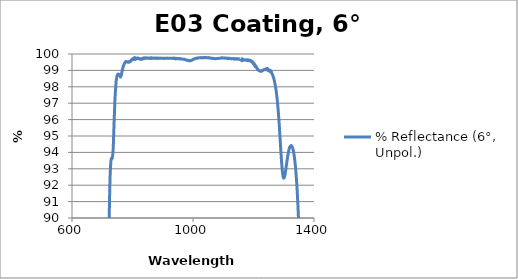
| Category | % Reflectance (6°, Unpol.) |
|---|---|
| 2500.0 | 4.981 |
| 2499.0 | 4.959 |
| 2498.0 | 4.927 |
| 2497.0 | 4.93 |
| 2496.0 | 4.921 |
| 2495.0 | 4.915 |
| 2494.0 | 4.916 |
| 2493.0 | 4.923 |
| 2492.0 | 4.924 |
| 2491.0 | 4.958 |
| 2490.0 | 4.956 |
| 2489.0 | 4.981 |
| 2488.0 | 4.993 |
| 2487.0 | 5.026 |
| 2486.0 | 5.058 |
| 2485.0 | 5.099 |
| 2484.0 | 5.131 |
| 2483.0 | 5.174 |
| 2482.0 | 5.209 |
| 2481.0 | 5.26 |
| 2480.0 | 5.331 |
| 2479.0 | 5.384 |
| 2478.0 | 5.448 |
| 2477.0 | 5.503 |
| 2476.0 | 5.581 |
| 2475.0 | 5.654 |
| 2474.0 | 5.726 |
| 2473.0 | 5.809 |
| 2472.0 | 5.899 |
| 2471.0 | 5.988 |
| 2470.0 | 6.072 |
| 2469.0 | 6.156 |
| 2468.0 | 6.258 |
| 2467.0 | 6.359 |
| 2466.0 | 6.477 |
| 2465.0 | 6.57 |
| 2464.0 | 6.68 |
| 2463.0 | 6.813 |
| 2462.0 | 6.91 |
| 2461.0 | 7.033 |
| 2460.0 | 7.154 |
| 2459.0 | 7.27 |
| 2458.0 | 7.398 |
| 2457.0 | 7.538 |
| 2456.0 | 7.675 |
| 2455.0 | 7.787 |
| 2454.0 | 7.933 |
| 2453.0 | 8.07 |
| 2452.0 | 8.208 |
| 2451.0 | 8.361 |
| 2450.0 | 8.51 |
| 2449.0 | 8.646 |
| 2448.0 | 8.807 |
| 2447.0 | 8.952 |
| 2446.0 | 9.11 |
| 2445.0 | 9.259 |
| 2444.0 | 9.414 |
| 2443.0 | 9.563 |
| 2442.0 | 9.729 |
| 2441.0 | 9.88 |
| 2440.0 | 10.042 |
| 2439.0 | 10.205 |
| 2438.0 | 10.359 |
| 2437.0 | 10.519 |
| 2436.0 | 10.681 |
| 2435.0 | 10.849 |
| 2434.0 | 10.995 |
| 2433.0 | 11.161 |
| 2432.0 | 11.319 |
| 2431.0 | 11.488 |
| 2430.0 | 11.649 |
| 2429.0 | 11.798 |
| 2428.0 | 11.949 |
| 2427.0 | 12.119 |
| 2426.0 | 12.28 |
| 2425.0 | 12.436 |
| 2424.0 | 12.58 |
| 2423.0 | 12.747 |
| 2422.0 | 12.904 |
| 2421.0 | 13.065 |
| 2420.0 | 13.196 |
| 2419.0 | 13.351 |
| 2418.0 | 13.484 |
| 2417.0 | 13.643 |
| 2416.0 | 13.805 |
| 2415.0 | 13.953 |
| 2414.0 | 14.081 |
| 2413.0 | 14.236 |
| 2412.0 | 14.357 |
| 2411.0 | 14.505 |
| 2410.0 | 14.645 |
| 2409.0 | 14.762 |
| 2408.0 | 14.898 |
| 2407.0 | 15.041 |
| 2406.0 | 15.161 |
| 2405.0 | 15.278 |
| 2404.0 | 15.391 |
| 2403.0 | 15.527 |
| 2402.0 | 15.629 |
| 2401.0 | 15.738 |
| 2400.0 | 15.85 |
| 2399.0 | 15.954 |
| 2398.0 | 16.058 |
| 2397.0 | 16.156 |
| 2396.0 | 16.263 |
| 2395.0 | 16.342 |
| 2394.0 | 16.436 |
| 2393.0 | 16.518 |
| 2392.0 | 16.617 |
| 2391.0 | 16.69 |
| 2390.0 | 16.768 |
| 2389.0 | 16.831 |
| 2388.0 | 16.919 |
| 2387.0 | 16.99 |
| 2386.0 | 17.047 |
| 2385.0 | 17.11 |
| 2384.0 | 17.152 |
| 2383.0 | 17.21 |
| 2382.0 | 17.271 |
| 2381.0 | 17.3 |
| 2380.0 | 17.351 |
| 2379.0 | 17.382 |
| 2378.0 | 17.423 |
| 2377.0 | 17.453 |
| 2376.0 | 17.483 |
| 2375.0 | 17.484 |
| 2374.0 | 17.507 |
| 2373.0 | 17.528 |
| 2372.0 | 17.542 |
| 2371.0 | 17.542 |
| 2370.0 | 17.541 |
| 2369.0 | 17.547 |
| 2368.0 | 17.515 |
| 2367.0 | 17.513 |
| 2366.0 | 17.498 |
| 2365.0 | 17.476 |
| 2364.0 | 17.45 |
| 2363.0 | 17.43 |
| 2362.0 | 17.399 |
| 2361.0 | 17.37 |
| 2360.0 | 17.327 |
| 2359.0 | 17.285 |
| 2358.0 | 17.238 |
| 2357.0 | 17.177 |
| 2356.0 | 17.123 |
| 2355.0 | 17.06 |
| 2354.0 | 17.004 |
| 2353.0 | 16.94 |
| 2352.0 | 16.875 |
| 2351.0 | 16.786 |
| 2350.0 | 16.708 |
| 2349.0 | 16.615 |
| 2348.0 | 16.534 |
| 2347.0 | 16.431 |
| 2346.0 | 16.347 |
| 2345.0 | 16.237 |
| 2344.0 | 16.149 |
| 2343.0 | 16.035 |
| 2342.0 | 15.941 |
| 2341.0 | 15.821 |
| 2340.0 | 15.702 |
| 2339.0 | 15.588 |
| 2338.0 | 15.453 |
| 2337.0 | 15.319 |
| 2336.0 | 15.207 |
| 2335.0 | 15.062 |
| 2334.0 | 14.923 |
| 2333.0 | 14.802 |
| 2332.0 | 14.645 |
| 2331.0 | 14.496 |
| 2330.0 | 14.365 |
| 2329.0 | 14.202 |
| 2328.0 | 14.052 |
| 2327.0 | 13.886 |
| 2326.0 | 13.751 |
| 2325.0 | 13.569 |
| 2324.0 | 13.414 |
| 2323.0 | 13.244 |
| 2322.0 | 13.088 |
| 2321.0 | 12.908 |
| 2320.0 | 12.74 |
| 2319.0 | 12.572 |
| 2318.0 | 12.396 |
| 2317.0 | 12.215 |
| 2316.0 | 12.029 |
| 2315.0 | 11.858 |
| 2314.0 | 11.696 |
| 2313.0 | 11.514 |
| 2312.0 | 11.333 |
| 2311.0 | 11.138 |
| 2310.0 | 10.982 |
| 2309.0 | 10.788 |
| 2308.0 | 10.601 |
| 2307.0 | 10.424 |
| 2306.0 | 10.25 |
| 2305.0 | 10.073 |
| 2304.0 | 9.895 |
| 2303.0 | 9.724 |
| 2302.0 | 9.542 |
| 2301.0 | 9.358 |
| 2300.0 | 9.181 |
| 2299.0 | 9.004 |
| 2298.0 | 8.844 |
| 2297.0 | 8.666 |
| 2296.0 | 8.506 |
| 2295.0 | 8.329 |
| 2294.0 | 8.17 |
| 2293.0 | 8.005 |
| 2292.0 | 7.854 |
| 2291.0 | 7.693 |
| 2290.0 | 7.538 |
| 2289.0 | 7.389 |
| 2288.0 | 7.246 |
| 2287.0 | 7.102 |
| 2286.0 | 6.969 |
| 2285.0 | 6.832 |
| 2284.0 | 6.696 |
| 2283.0 | 6.573 |
| 2282.0 | 6.446 |
| 2281.0 | 6.325 |
| 2280.0 | 6.217 |
| 2279.0 | 6.101 |
| 2278.0 | 5.986 |
| 2277.0 | 5.882 |
| 2276.0 | 5.777 |
| 2275.0 | 5.687 |
| 2274.0 | 5.605 |
| 2273.0 | 5.516 |
| 2272.0 | 5.429 |
| 2271.0 | 5.365 |
| 2270.0 | 5.294 |
| 2269.0 | 5.239 |
| 2268.0 | 5.188 |
| 2267.0 | 5.144 |
| 2266.0 | 5.108 |
| 2265.0 | 5.073 |
| 2264.0 | 5.055 |
| 2263.0 | 5.033 |
| 2262.0 | 5.031 |
| 2261.0 | 5.028 |
| 2260.0 | 5.031 |
| 2259.0 | 5.056 |
| 2258.0 | 5.073 |
| 2257.0 | 5.098 |
| 2256.0 | 5.137 |
| 2255.0 | 5.173 |
| 2254.0 | 5.228 |
| 2253.0 | 5.285 |
| 2252.0 | 5.344 |
| 2251.0 | 5.418 |
| 2250.0 | 5.487 |
| 2249.0 | 5.569 |
| 2248.0 | 5.659 |
| 2247.0 | 5.744 |
| 2246.0 | 5.849 |
| 2245.0 | 5.947 |
| 2244.0 | 6.063 |
| 2243.0 | 6.182 |
| 2242.0 | 6.309 |
| 2241.0 | 6.433 |
| 2240.0 | 6.567 |
| 2239.0 | 6.714 |
| 2238.0 | 6.858 |
| 2237.0 | 7.007 |
| 2236.0 | 7.172 |
| 2235.0 | 7.334 |
| 2234.0 | 7.489 |
| 2233.0 | 7.665 |
| 2232.0 | 7.839 |
| 2231.0 | 8.013 |
| 2230.0 | 8.203 |
| 2229.0 | 8.398 |
| 2228.0 | 8.577 |
| 2227.0 | 8.773 |
| 2226.0 | 8.981 |
| 2225.0 | 9.169 |
| 2224.0 | 9.382 |
| 2223.0 | 9.581 |
| 2222.0 | 9.787 |
| 2221.0 | 10.001 |
| 2220.0 | 10.222 |
| 2219.0 | 10.435 |
| 2218.0 | 10.647 |
| 2217.0 | 10.869 |
| 2216.0 | 11.075 |
| 2215.0 | 11.296 |
| 2214.0 | 11.524 |
| 2213.0 | 11.749 |
| 2212.0 | 11.963 |
| 2211.0 | 12.184 |
| 2210.0 | 12.412 |
| 2209.0 | 12.62 |
| 2208.0 | 12.847 |
| 2207.0 | 13.069 |
| 2206.0 | 13.284 |
| 2205.0 | 13.5 |
| 2204.0 | 13.718 |
| 2203.0 | 13.924 |
| 2202.0 | 14.134 |
| 2201.0 | 14.353 |
| 2200.0 | 14.55 |
| 2199.0 | 14.755 |
| 2198.0 | 14.946 |
| 2197.0 | 15.14 |
| 2196.0 | 15.333 |
| 2195.0 | 15.523 |
| 2194.0 | 15.711 |
| 2193.0 | 15.887 |
| 2192.0 | 16.064 |
| 2191.0 | 16.238 |
| 2190.0 | 16.406 |
| 2189.0 | 16.573 |
| 2188.0 | 16.74 |
| 2187.0 | 16.88 |
| 2186.0 | 17.046 |
| 2185.0 | 17.195 |
| 2184.0 | 17.336 |
| 2183.0 | 17.479 |
| 2182.0 | 17.616 |
| 2181.0 | 17.745 |
| 2180.0 | 17.867 |
| 2179.0 | 17.996 |
| 2178.0 | 18.098 |
| 2177.0 | 18.212 |
| 2176.0 | 18.324 |
| 2175.0 | 18.417 |
| 2174.0 | 18.495 |
| 2173.0 | 18.588 |
| 2172.0 | 18.667 |
| 2171.0 | 18.74 |
| 2170.0 | 18.805 |
| 2169.0 | 18.863 |
| 2168.0 | 18.914 |
| 2167.0 | 18.963 |
| 2166.0 | 18.998 |
| 2165.0 | 19.028 |
| 2164.0 | 19.052 |
| 2163.0 | 19.072 |
| 2162.0 | 19.08 |
| 2161.0 | 19.088 |
| 2160.0 | 19.09 |
| 2159.0 | 19.079 |
| 2158.0 | 19.062 |
| 2157.0 | 19.036 |
| 2156.0 | 19.003 |
| 2155.0 | 18.96 |
| 2154.0 | 18.916 |
| 2153.0 | 18.866 |
| 2152.0 | 18.809 |
| 2151.0 | 18.737 |
| 2150.0 | 18.654 |
| 2149.0 | 18.588 |
| 2148.0 | 18.501 |
| 2147.0 | 18.389 |
| 2146.0 | 18.306 |
| 2145.0 | 18.193 |
| 2144.0 | 18.074 |
| 2143.0 | 17.953 |
| 2142.0 | 17.819 |
| 2141.0 | 17.678 |
| 2140.0 | 17.528 |
| 2139.0 | 17.378 |
| 2138.0 | 17.217 |
| 2137.0 | 17.049 |
| 2136.0 | 16.886 |
| 2135.0 | 16.703 |
| 2134.0 | 16.524 |
| 2133.0 | 16.332 |
| 2132.0 | 16.134 |
| 2131.0 | 15.922 |
| 2130.0 | 15.714 |
| 2129.0 | 15.489 |
| 2128.0 | 15.272 |
| 2127.0 | 15.054 |
| 2126.0 | 14.816 |
| 2125.0 | 14.567 |
| 2124.0 | 14.329 |
| 2123.0 | 14.081 |
| 2122.0 | 13.826 |
| 2121.0 | 13.566 |
| 2120.0 | 13.312 |
| 2119.0 | 13.038 |
| 2118.0 | 12.766 |
| 2117.0 | 12.5 |
| 2116.0 | 12.208 |
| 2115.0 | 11.935 |
| 2114.0 | 11.663 |
| 2113.0 | 11.362 |
| 2112.0 | 11.082 |
| 2111.0 | 10.8 |
| 2110.0 | 10.497 |
| 2109.0 | 10.211 |
| 2108.0 | 9.934 |
| 2107.0 | 9.632 |
| 2106.0 | 9.33 |
| 2105.0 | 9.052 |
| 2104.0 | 8.755 |
| 2103.0 | 8.463 |
| 2102.0 | 8.185 |
| 2101.0 | 7.895 |
| 2100.0 | 7.608 |
| 2099.0 | 7.331 |
| 2098.0 | 7.065 |
| 2097.0 | 6.788 |
| 2096.0 | 6.519 |
| 2095.0 | 6.267 |
| 2094.0 | 5.999 |
| 2093.0 | 5.748 |
| 2092.0 | 5.511 |
| 2091.0 | 5.273 |
| 2090.0 | 5.045 |
| 2089.0 | 4.822 |
| 2088.0 | 4.608 |
| 2087.0 | 4.396 |
| 2086.0 | 4.21 |
| 2085.0 | 4.027 |
| 2084.0 | 3.848 |
| 2083.0 | 3.689 |
| 2082.0 | 3.529 |
| 2081.0 | 3.396 |
| 2080.0 | 3.264 |
| 2079.0 | 3.151 |
| 2078.0 | 3.043 |
| 2077.0 | 2.964 |
| 2076.0 | 2.883 |
| 2075.0 | 2.816 |
| 2074.0 | 2.77 |
| 2073.0 | 2.729 |
| 2072.0 | 2.715 |
| 2071.0 | 2.706 |
| 2070.0 | 2.717 |
| 2069.0 | 2.742 |
| 2068.0 | 2.778 |
| 2067.0 | 2.836 |
| 2066.0 | 2.906 |
| 2065.0 | 2.987 |
| 2064.0 | 3.082 |
| 2063.0 | 3.201 |
| 2062.0 | 3.333 |
| 2061.0 | 3.477 |
| 2060.0 | 3.633 |
| 2059.0 | 3.812 |
| 2058.0 | 4.002 |
| 2057.0 | 4.199 |
| 2056.0 | 4.428 |
| 2055.0 | 4.655 |
| 2054.0 | 4.899 |
| 2053.0 | 5.15 |
| 2052.0 | 5.433 |
| 2051.0 | 5.702 |
| 2050.0 | 6.005 |
| 2049.0 | 6.319 |
| 2048.0 | 6.626 |
| 2047.0 | 6.958 |
| 2046.0 | 7.297 |
| 2045.0 | 7.641 |
| 2044.0 | 7.994 |
| 2043.0 | 8.37 |
| 2042.0 | 8.745 |
| 2041.0 | 9.122 |
| 2040.0 | 9.513 |
| 2039.0 | 9.904 |
| 2038.0 | 10.294 |
| 2037.0 | 10.714 |
| 2036.0 | 11.125 |
| 2035.0 | 11.525 |
| 2034.0 | 11.95 |
| 2033.0 | 12.381 |
| 2032.0 | 12.793 |
| 2031.0 | 13.216 |
| 2030.0 | 13.653 |
| 2029.0 | 14.069 |
| 2028.0 | 14.504 |
| 2027.0 | 14.93 |
| 2026.0 | 15.349 |
| 2025.0 | 15.768 |
| 2024.0 | 16.202 |
| 2023.0 | 16.614 |
| 2022.0 | 17.025 |
| 2021.0 | 17.449 |
| 2020.0 | 17.86 |
| 2019.0 | 18.246 |
| 2018.0 | 18.661 |
| 2017.0 | 19.064 |
| 2016.0 | 19.445 |
| 2015.0 | 19.826 |
| 2014.0 | 20.209 |
| 2013.0 | 20.572 |
| 2012.0 | 20.945 |
| 2011.0 | 21.309 |
| 2010.0 | 21.649 |
| 2009.0 | 22.004 |
| 2008.0 | 22.331 |
| 2007.0 | 22.647 |
| 2006.0 | 22.969 |
| 2005.0 | 23.282 |
| 2004.0 | 23.578 |
| 2003.0 | 23.869 |
| 2002.0 | 24.152 |
| 2001.0 | 24.424 |
| 2000.0 | 24.675 |
| 1999.0 | 24.936 |
| 1998.0 | 25.164 |
| 1997.0 | 25.385 |
| 1996.0 | 25.613 |
| 1995.0 | 25.818 |
| 1994.0 | 26.007 |
| 1993.0 | 26.196 |
| 1992.0 | 26.374 |
| 1991.0 | 26.538 |
| 1990.0 | 26.69 |
| 1989.0 | 26.827 |
| 1988.0 | 26.952 |
| 1987.0 | 27.07 |
| 1986.0 | 27.176 |
| 1985.0 | 27.272 |
| 1984.0 | 27.344 |
| 1983.0 | 27.411 |
| 1982.0 | 27.469 |
| 1981.0 | 27.51 |
| 1980.0 | 27.534 |
| 1979.0 | 27.56 |
| 1978.0 | 27.561 |
| 1977.0 | 27.552 |
| 1976.0 | 27.535 |
| 1975.0 | 27.498 |
| 1974.0 | 27.45 |
| 1973.0 | 27.391 |
| 1972.0 | 27.313 |
| 1971.0 | 27.232 |
| 1970.0 | 27.128 |
| 1969.0 | 27.018 |
| 1968.0 | 26.89 |
| 1967.0 | 26.748 |
| 1966.0 | 26.604 |
| 1965.0 | 26.437 |
| 1964.0 | 26.266 |
| 1963.0 | 26.066 |
| 1962.0 | 25.854 |
| 1961.0 | 25.637 |
| 1960.0 | 25.421 |
| 1959.0 | 25.158 |
| 1958.0 | 24.894 |
| 1957.0 | 24.631 |
| 1956.0 | 24.354 |
| 1955.0 | 24.043 |
| 1954.0 | 23.714 |
| 1953.0 | 23.408 |
| 1952.0 | 23.069 |
| 1951.0 | 22.725 |
| 1950.0 | 22.37 |
| 1949.0 | 21.995 |
| 1948.0 | 21.61 |
| 1947.0 | 21.225 |
| 1946.0 | 20.827 |
| 1945.0 | 20.407 |
| 1944.0 | 19.987 |
| 1943.0 | 19.546 |
| 1942.0 | 19.086 |
| 1941.0 | 18.632 |
| 1940.0 | 18.166 |
| 1939.0 | 17.68 |
| 1938.0 | 17.196 |
| 1937.0 | 16.707 |
| 1936.0 | 16.2 |
| 1935.0 | 15.678 |
| 1934.0 | 15.176 |
| 1933.0 | 14.652 |
| 1932.0 | 14.123 |
| 1931.0 | 13.63 |
| 1930.0 | 13.11 |
| 1929.0 | 12.577 |
| 1928.0 | 12.06 |
| 1927.0 | 11.537 |
| 1926.0 | 11.006 |
| 1925.0 | 10.487 |
| 1924.0 | 9.982 |
| 1923.0 | 9.452 |
| 1922.0 | 8.947 |
| 1921.0 | 8.437 |
| 1920.0 | 7.933 |
| 1919.0 | 7.432 |
| 1918.0 | 6.956 |
| 1917.0 | 6.486 |
| 1916.0 | 6.03 |
| 1915.0 | 5.612 |
| 1914.0 | 5.193 |
| 1913.0 | 4.786 |
| 1912.0 | 4.411 |
| 1911.0 | 4.046 |
| 1910.0 | 3.709 |
| 1909.0 | 3.404 |
| 1908.0 | 3.122 |
| 1907.0 | 2.851 |
| 1906.0 | 2.61 |
| 1905.0 | 2.379 |
| 1904.0 | 2.18 |
| 1903.0 | 2.021 |
| 1902.0 | 1.893 |
| 1901.0 | 1.79 |
| 1900.0 | 1.72 |
| 1899.0 | 1.672 |
| 1898.0 | 1.666 |
| 1897.0 | 1.684 |
| 1896.0 | 1.749 |
| 1895.0 | 1.836 |
| 1894.0 | 1.96 |
| 1893.0 | 2.103 |
| 1892.0 | 2.3 |
| 1891.0 | 2.525 |
| 1890.0 | 2.773 |
| 1889.0 | 3.061 |
| 1888.0 | 3.375 |
| 1887.0 | 3.696 |
| 1886.0 | 4.073 |
| 1885.0 | 4.48 |
| 1884.0 | 4.881 |
| 1883.0 | 5.308 |
| 1882.0 | 5.755 |
| 1881.0 | 6.205 |
| 1880.0 | 6.687 |
| 1879.0 | 7.195 |
| 1878.0 | 7.716 |
| 1877.0 | 8.268 |
| 1876.0 | 8.889 |
| 1875.0 | 9.52 |
| 1874.0 | 10.182 |
| 1873.0 | 10.902 |
| 1872.0 | 11.627 |
| 1871.0 | 12.355 |
| 1870.0 | 13.107 |
| 1869.0 | 13.859 |
| 1868.0 | 14.567 |
| 1867.0 | 15.3 |
| 1866.0 | 16.018 |
| 1865.0 | 16.684 |
| 1864.0 | 17.34 |
| 1863.0 | 17.978 |
| 1862.0 | 18.605 |
| 1861.0 | 19.229 |
| 1860.0 | 19.881 |
| 1859.0 | 20.514 |
| 1858.0 | 21.139 |
| 1857.0 | 21.752 |
| 1856.0 | 22.364 |
| 1855.0 | 22.996 |
| 1854.0 | 23.649 |
| 1853.0 | 24.295 |
| 1852.0 | 24.878 |
| 1851.0 | 25.474 |
| 1850.0 | 26.053 |
| 1849.0 | 26.579 |
| 1848.0 | 27.119 |
| 1847.0 | 27.654 |
| 1846.0 | 28.166 |
| 1845.0 | 28.644 |
| 1844.0 | 29.136 |
| 1843.0 | 29.599 |
| 1842.0 | 30.057 |
| 1841.0 | 30.501 |
| 1840.0 | 30.936 |
| 1839.0 | 31.339 |
| 1838.0 | 31.738 |
| 1837.0 | 32.102 |
| 1836.0 | 32.436 |
| 1835.0 | 32.793 |
| 1834.0 | 33.12 |
| 1833.0 | 33.425 |
| 1832.0 | 33.707 |
| 1831.0 | 33.957 |
| 1830.0 | 34.169 |
| 1829.0 | 34.382 |
| 1828.0 | 34.582 |
| 1827.0 | 34.75 |
| 1826.0 | 34.9 |
| 1825.0 | 35.038 |
| 1824.0 | 35.163 |
| 1823.0 | 35.258 |
| 1822.0 | 35.347 |
| 1821.0 | 35.401 |
| 1820.0 | 35.445 |
| 1819.0 | 35.464 |
| 1818.0 | 35.471 |
| 1817.0 | 35.461 |
| 1816.0 | 35.42 |
| 1815.0 | 35.366 |
| 1814.0 | 35.284 |
| 1813.0 | 35.193 |
| 1812.0 | 35.078 |
| 1811.0 | 34.943 |
| 1810.0 | 34.786 |
| 1809.0 | 34.606 |
| 1808.0 | 34.416 |
| 1807.0 | 34.194 |
| 1806.0 | 33.96 |
| 1805.0 | 33.69 |
| 1804.0 | 33.417 |
| 1803.0 | 33.112 |
| 1802.0 | 32.795 |
| 1801.0 | 32.463 |
| 1800.0 | 32.083 |
| 1799.0 | 31.709 |
| 1798.0 | 31.304 |
| 1797.0 | 30.879 |
| 1796.0 | 30.422 |
| 1795.0 | 29.972 |
| 1794.0 | 29.494 |
| 1793.0 | 28.973 |
| 1792.0 | 28.479 |
| 1791.0 | 27.911 |
| 1790.0 | 27.347 |
| 1789.0 | 26.786 |
| 1788.0 | 26.169 |
| 1787.0 | 25.549 |
| 1786.0 | 24.918 |
| 1785.0 | 24.263 |
| 1784.0 | 23.577 |
| 1783.0 | 22.896 |
| 1782.0 | 22.201 |
| 1781.0 | 21.461 |
| 1780.0 | 20.745 |
| 1779.0 | 20.012 |
| 1778.0 | 19.237 |
| 1777.0 | 18.464 |
| 1776.0 | 17.716 |
| 1775.0 | 16.927 |
| 1774.0 | 16.134 |
| 1773.0 | 15.367 |
| 1772.0 | 14.569 |
| 1771.0 | 13.759 |
| 1770.0 | 12.991 |
| 1769.0 | 12.201 |
| 1768.0 | 11.426 |
| 1767.0 | 10.674 |
| 1766.0 | 9.904 |
| 1765.0 | 9.153 |
| 1764.0 | 8.425 |
| 1763.0 | 7.717 |
| 1762.0 | 7.015 |
| 1761.0 | 6.35 |
| 1760.0 | 5.725 |
| 1759.0 | 5.086 |
| 1758.0 | 4.512 |
| 1757.0 | 3.964 |
| 1756.0 | 3.451 |
| 1755.0 | 2.96 |
| 1754.0 | 2.532 |
| 1753.0 | 2.126 |
| 1752.0 | 1.764 |
| 1751.0 | 1.459 |
| 1750.0 | 1.185 |
| 1749.0 | 0.966 |
| 1748.0 | 0.794 |
| 1747.0 | 0.669 |
| 1746.0 | 0.589 |
| 1745.0 | 0.555 |
| 1744.0 | 0.571 |
| 1743.0 | 0.645 |
| 1742.0 | 0.753 |
| 1741.0 | 0.909 |
| 1740.0 | 1.126 |
| 1739.0 | 1.365 |
| 1738.0 | 1.661 |
| 1737.0 | 1.99 |
| 1736.0 | 2.353 |
| 1735.0 | 2.757 |
| 1734.0 | 3.207 |
| 1733.0 | 3.686 |
| 1732.0 | 4.177 |
| 1731.0 | 4.719 |
| 1730.0 | 5.276 |
| 1729.0 | 5.836 |
| 1728.0 | 6.446 |
| 1727.0 | 7.065 |
| 1726.0 | 7.686 |
| 1725.0 | 8.333 |
| 1724.0 | 8.987 |
| 1723.0 | 9.631 |
| 1722.0 | 10.295 |
| 1721.0 | 10.976 |
| 1720.0 | 11.63 |
| 1719.0 | 12.281 |
| 1718.0 | 12.952 |
| 1717.0 | 13.602 |
| 1716.0 | 14.227 |
| 1715.0 | 14.868 |
| 1714.0 | 15.51 |
| 1713.0 | 16.092 |
| 1712.0 | 16.704 |
| 1711.0 | 17.277 |
| 1710.0 | 17.828 |
| 1709.0 | 18.379 |
| 1708.0 | 18.912 |
| 1707.0 | 19.404 |
| 1706.0 | 19.887 |
| 1705.0 | 20.354 |
| 1704.0 | 20.776 |
| 1703.0 | 21.19 |
| 1702.0 | 21.59 |
| 1701.0 | 21.95 |
| 1700.0 | 22.289 |
| 1699.0 | 22.609 |
| 1698.0 | 22.889 |
| 1697.0 | 23.142 |
| 1696.0 | 23.38 |
| 1695.0 | 23.592 |
| 1694.0 | 23.755 |
| 1693.0 | 23.904 |
| 1692.0 | 24.045 |
| 1691.0 | 24.122 |
| 1690.0 | 24.182 |
| 1689.0 | 24.226 |
| 1688.0 | 24.236 |
| 1687.0 | 24.202 |
| 1686.0 | 24.146 |
| 1685.0 | 24.071 |
| 1684.0 | 23.957 |
| 1683.0 | 23.81 |
| 1682.0 | 23.652 |
| 1681.0 | 23.45 |
| 1680.0 | 23.218 |
| 1679.0 | 22.949 |
| 1678.0 | 22.673 |
| 1677.0 | 22.354 |
| 1676.0 | 21.992 |
| 1675.0 | 21.648 |
| 1674.0 | 21.236 |
| 1673.0 | 20.8 |
| 1672.0 | 20.367 |
| 1671.0 | 19.883 |
| 1670.0 | 19.36 |
| 1669.0 | 18.846 |
| 1668.0 | 18.296 |
| 1667.0 | 17.719 |
| 1666.0 | 17.132 |
| 1665.0 | 16.532 |
| 1664.0 | 15.877 |
| 1663.0 | 15.241 |
| 1662.0 | 14.579 |
| 1661.0 | 13.907 |
| 1660.0 | 13.217 |
| 1659.0 | 12.529 |
| 1658.0 | 11.826 |
| 1657.0 | 11.113 |
| 1656.0 | 10.427 |
| 1655.0 | 9.714 |
| 1654.0 | 9.023 |
| 1653.0 | 8.352 |
| 1652.0 | 7.667 |
| 1651.0 | 6.996 |
| 1650.0 | 6.375 |
| 1649.0 | 5.756 |
| 1648.0 | 5.157 |
| 1647.0 | 4.611 |
| 1646.0 | 4.08 |
| 1645.0 | 3.578 |
| 1644.0 | 3.136 |
| 1643.0 | 2.732 |
| 1642.0 | 2.372 |
| 1641.0 | 2.063 |
| 1640.0 | 1.81 |
| 1639.0 | 1.609 |
| 1638.0 | 1.466 |
| 1637.0 | 1.381 |
| 1636.0 | 1.353 |
| 1635.0 | 1.391 |
| 1634.0 | 1.495 |
| 1633.0 | 1.659 |
| 1632.0 | 1.882 |
| 1631.0 | 2.152 |
| 1630.0 | 2.498 |
| 1629.0 | 2.904 |
| 1628.0 | 3.347 |
| 1627.0 | 3.857 |
| 1626.0 | 4.421 |
| 1625.0 | 5.019 |
| 1624.0 | 5.672 |
| 1623.0 | 6.366 |
| 1622.0 | 7.079 |
| 1621.0 | 7.834 |
| 1620.0 | 8.642 |
| 1619.0 | 9.464 |
| 1618.0 | 10.263 |
| 1617.0 | 11.137 |
| 1616.0 | 11.997 |
| 1615.0 | 12.847 |
| 1614.0 | 13.759 |
| 1613.0 | 14.664 |
| 1612.0 | 15.508 |
| 1611.0 | 16.392 |
| 1610.0 | 17.283 |
| 1609.0 | 18.112 |
| 1608.0 | 18.966 |
| 1607.0 | 19.812 |
| 1606.0 | 20.613 |
| 1605.0 | 21.401 |
| 1604.0 | 22.175 |
| 1603.0 | 22.901 |
| 1602.0 | 23.608 |
| 1601.0 | 24.308 |
| 1600.0 | 24.962 |
| 1599.0 | 25.577 |
| 1598.0 | 26.169 |
| 1597.0 | 26.731 |
| 1596.0 | 27.248 |
| 1595.0 | 27.748 |
| 1594.0 | 28.192 |
| 1593.0 | 28.593 |
| 1592.0 | 28.985 |
| 1591.0 | 29.319 |
| 1590.0 | 29.615 |
| 1589.0 | 29.881 |
| 1588.0 | 30.113 |
| 1587.0 | 30.265 |
| 1586.0 | 30.417 |
| 1585.0 | 30.527 |
| 1584.0 | 30.575 |
| 1583.0 | 30.58 |
| 1582.0 | 30.564 |
| 1581.0 | 30.489 |
| 1580.0 | 30.374 |
| 1579.0 | 30.208 |
| 1578.0 | 30.016 |
| 1577.0 | 29.775 |
| 1576.0 | 29.477 |
| 1575.0 | 29.145 |
| 1574.0 | 28.778 |
| 1573.0 | 28.346 |
| 1572.0 | 27.871 |
| 1571.0 | 27.381 |
| 1570.0 | 26.822 |
| 1569.0 | 26.231 |
| 1568.0 | 25.592 |
| 1567.0 | 24.89 |
| 1566.0 | 24.171 |
| 1565.0 | 23.436 |
| 1564.0 | 22.619 |
| 1563.0 | 21.772 |
| 1562.0 | 20.898 |
| 1561.0 | 20.003 |
| 1560.0 | 19.037 |
| 1559.0 | 18.086 |
| 1558.0 | 17.104 |
| 1557.0 | 16.066 |
| 1556.0 | 15.034 |
| 1555.0 | 14.009 |
| 1554.0 | 12.965 |
| 1553.0 | 11.91 |
| 1552.0 | 10.903 |
| 1551.0 | 9.864 |
| 1550.0 | 8.849 |
| 1549.0 | 7.908 |
| 1548.0 | 6.955 |
| 1547.0 | 6.079 |
| 1546.0 | 5.252 |
| 1545.0 | 4.484 |
| 1544.0 | 3.786 |
| 1543.0 | 3.172 |
| 1542.0 | 2.654 |
| 1541.0 | 2.218 |
| 1540.0 | 1.893 |
| 1539.0 | 1.68 |
| 1538.0 | 1.569 |
| 1537.0 | 1.569 |
| 1536.0 | 1.7 |
| 1535.0 | 1.933 |
| 1534.0 | 2.304 |
| 1533.0 | 2.767 |
| 1532.0 | 3.377 |
| 1531.0 | 4.088 |
| 1530.0 | 4.863 |
| 1529.0 | 5.778 |
| 1528.0 | 6.777 |
| 1527.0 | 7.827 |
| 1526.0 | 8.98 |
| 1525.0 | 10.21 |
| 1524.0 | 11.474 |
| 1523.0 | 12.774 |
| 1522.0 | 14.124 |
| 1521.0 | 15.465 |
| 1520.0 | 16.865 |
| 1519.0 | 18.294 |
| 1518.0 | 19.692 |
| 1517.0 | 21.069 |
| 1516.0 | 22.441 |
| 1515.0 | 23.827 |
| 1514.0 | 25.121 |
| 1513.0 | 26.441 |
| 1512.0 | 27.724 |
| 1511.0 | 28.917 |
| 1510.0 | 30.117 |
| 1509.0 | 31.257 |
| 1508.0 | 32.317 |
| 1507.0 | 33.362 |
| 1506.0 | 34.359 |
| 1505.0 | 35.27 |
| 1504.0 | 36.156 |
| 1503.0 | 36.975 |
| 1502.0 | 37.73 |
| 1501.0 | 38.405 |
| 1500.0 | 39.067 |
| 1499.0 | 39.66 |
| 1498.0 | 40.176 |
| 1497.0 | 40.65 |
| 1496.0 | 41.04 |
| 1495.0 | 41.357 |
| 1494.0 | 41.628 |
| 1493.0 | 41.887 |
| 1492.0 | 42.049 |
| 1491.0 | 42.136 |
| 1490.0 | 42.164 |
| 1489.0 | 42.123 |
| 1488.0 | 42.032 |
| 1487.0 | 41.882 |
| 1486.0 | 41.669 |
| 1485.0 | 41.374 |
| 1484.0 | 41.015 |
| 1483.0 | 40.604 |
| 1482.0 | 40.117 |
| 1481.0 | 39.54 |
| 1480.0 | 38.91 |
| 1479.0 | 38.21 |
| 1478.0 | 37.44 |
| 1477.0 | 36.6 |
| 1476.0 | 35.719 |
| 1475.0 | 34.738 |
| 1474.0 | 33.669 |
| 1473.0 | 32.591 |
| 1472.0 | 31.387 |
| 1471.0 | 30.131 |
| 1470.0 | 28.878 |
| 1469.0 | 27.501 |
| 1468.0 | 26.08 |
| 1467.0 | 24.705 |
| 1466.0 | 23.264 |
| 1465.0 | 21.824 |
| 1464.0 | 20.41 |
| 1463.0 | 18.998 |
| 1462.0 | 17.604 |
| 1461.0 | 16.308 |
| 1460.0 | 15.103 |
| 1459.0 | 13.992 |
| 1458.0 | 13.007 |
| 1457.0 | 12.207 |
| 1456.0 | 11.547 |
| 1455.0 | 11.09 |
| 1454.0 | 10.861 |
| 1453.0 | 10.853 |
| 1452.0 | 11.088 |
| 1451.0 | 11.541 |
| 1450.0 | 12.272 |
| 1449.0 | 13.247 |
| 1448.0 | 14.408 |
| 1447.0 | 15.812 |
| 1446.0 | 17.432 |
| 1445.0 | 19.166 |
| 1444.0 | 21.094 |
| 1443.0 | 23.202 |
| 1442.0 | 25.322 |
| 1441.0 | 27.537 |
| 1440.0 | 29.814 |
| 1439.0 | 32.102 |
| 1438.0 | 34.331 |
| 1437.0 | 36.663 |
| 1436.0 | 38.934 |
| 1435.0 | 41.063 |
| 1434.0 | 43.236 |
| 1433.0 | 45.292 |
| 1432.0 | 47.242 |
| 1431.0 | 49.169 |
| 1430.0 | 51.012 |
| 1429.0 | 52.7 |
| 1428.0 | 54.328 |
| 1427.0 | 55.86 |
| 1426.0 | 57.272 |
| 1425.0 | 58.624 |
| 1424.0 | 59.908 |
| 1423.0 | 61.09 |
| 1422.0 | 62.208 |
| 1421.0 | 63.219 |
| 1420.0 | 64.098 |
| 1419.0 | 65.004 |
| 1418.0 | 65.858 |
| 1417.0 | 66.565 |
| 1416.0 | 67.23 |
| 1415.0 | 67.814 |
| 1414.0 | 68.416 |
| 1413.0 | 68.863 |
| 1412.0 | 69.285 |
| 1411.0 | 69.702 |
| 1410.0 | 69.98 |
| 1409.0 | 70.258 |
| 1408.0 | 70.455 |
| 1407.0 | 70.624 |
| 1406.0 | 70.732 |
| 1405.0 | 70.817 |
| 1404.0 | 70.87 |
| 1403.0 | 70.814 |
| 1402.0 | 70.739 |
| 1401.0 | 70.607 |
| 1400.0 | 70.491 |
| 1399.0 | 70.239 |
| 1398.0 | 70.003 |
| 1397.0 | 69.747 |
| 1396.0 | 69.354 |
| 1395.0 | 68.981 |
| 1394.0 | 68.562 |
| 1393.0 | 68.105 |
| 1392.0 | 67.61 |
| 1391.0 | 67.137 |
| 1390.0 | 66.612 |
| 1389.0 | 66.09 |
| 1388.0 | 65.608 |
| 1387.0 | 65.089 |
| 1386.0 | 64.583 |
| 1385.0 | 64.143 |
| 1384.0 | 63.695 |
| 1383.0 | 63.328 |
| 1382.0 | 63.043 |
| 1381.0 | 62.855 |
| 1380.0 | 62.786 |
| 1379.0 | 62.839 |
| 1378.0 | 63.001 |
| 1377.0 | 63.305 |
| 1376.0 | 63.725 |
| 1375.0 | 64.259 |
| 1374.0 | 64.96 |
| 1373.0 | 65.782 |
| 1372.0 | 66.725 |
| 1371.0 | 67.769 |
| 1370.0 | 68.95 |
| 1369.0 | 70.14 |
| 1368.0 | 71.427 |
| 1367.0 | 72.769 |
| 1366.0 | 74.056 |
| 1365.0 | 75.384 |
| 1364.0 | 76.691 |
| 1363.0 | 77.945 |
| 1362.0 | 79.184 |
| 1361.0 | 80.398 |
| 1360.0 | 81.528 |
| 1359.0 | 82.56 |
| 1358.0 | 83.588 |
| 1357.0 | 84.497 |
| 1356.0 | 85.344 |
| 1355.0 | 86.159 |
| 1354.0 | 86.897 |
| 1353.0 | 87.57 |
| 1352.0 | 88.218 |
| 1351.0 | 88.817 |
| 1350.0 | 89.323 |
| 1349.0 | 89.829 |
| 1348.0 | 90.273 |
| 1347.0 | 90.705 |
| 1346.0 | 91.086 |
| 1345.0 | 91.454 |
| 1344.0 | 91.79 |
| 1343.0 | 92.081 |
| 1342.0 | 92.363 |
| 1341.0 | 92.591 |
| 1340.0 | 92.847 |
| 1339.0 | 93.055 |
| 1338.0 | 93.246 |
| 1337.0 | 93.426 |
| 1336.0 | 93.588 |
| 1335.0 | 93.733 |
| 1334.0 | 93.852 |
| 1333.0 | 93.966 |
| 1332.0 | 94.077 |
| 1331.0 | 94.147 |
| 1330.0 | 94.224 |
| 1329.0 | 94.287 |
| 1328.0 | 94.323 |
| 1327.0 | 94.367 |
| 1326.0 | 94.389 |
| 1325.0 | 94.417 |
| 1324.0 | 94.406 |
| 1323.0 | 94.406 |
| 1322.0 | 94.388 |
| 1321.0 | 94.356 |
| 1320.0 | 94.326 |
| 1319.0 | 94.279 |
| 1318.0 | 94.218 |
| 1317.0 | 94.161 |
| 1316.0 | 94.055 |
| 1315.0 | 93.974 |
| 1314.0 | 93.834 |
| 1313.0 | 93.791 |
| 1312.0 | 93.638 |
| 1311.0 | 93.513 |
| 1310.0 | 93.37 |
| 1309.0 | 93.244 |
| 1308.0 | 93.131 |
| 1307.0 | 92.994 |
| 1306.0 | 92.851 |
| 1305.0 | 92.723 |
| 1304.0 | 92.632 |
| 1303.0 | 92.547 |
| 1302.0 | 92.479 |
| 1301.0 | 92.448 |
| 1300.0 | 92.425 |
| 1299.0 | 92.465 |
| 1298.0 | 92.523 |
| 1297.0 | 92.639 |
| 1296.0 | 92.765 |
| 1295.0 | 92.95 |
| 1294.0 | 93.142 |
| 1293.0 | 93.381 |
| 1292.0 | 93.652 |
| 1291.0 | 93.933 |
| 1290.0 | 94.211 |
| 1289.0 | 94.513 |
| 1288.0 | 94.814 |
| 1287.0 | 95.123 |
| 1286.0 | 95.404 |
| 1285.0 | 95.709 |
| 1284.0 | 95.961 |
| 1283.0 | 96.223 |
| 1282.0 | 96.47 |
| 1281.0 | 96.697 |
| 1280.0 | 96.891 |
| 1279.0 | 97.109 |
| 1278.0 | 97.283 |
| 1277.0 | 97.443 |
| 1276.0 | 97.6 |
| 1275.0 | 97.748 |
| 1274.0 | 97.853 |
| 1273.0 | 97.993 |
| 1272.0 | 98.091 |
| 1271.0 | 98.187 |
| 1270.0 | 98.256 |
| 1269.0 | 98.364 |
| 1268.0 | 98.44 |
| 1267.0 | 98.51 |
| 1266.0 | 98.58 |
| 1265.0 | 98.621 |
| 1264.0 | 98.678 |
| 1263.0 | 98.734 |
| 1262.0 | 98.761 |
| 1261.0 | 98.806 |
| 1260.0 | 98.839 |
| 1259.0 | 98.934 |
| 1258.0 | 98.901 |
| 1257.0 | 98.988 |
| 1256.0 | 98.91 |
| 1255.0 | 98.92 |
| 1254.0 | 98.985 |
| 1253.0 | 99.013 |
| 1252.0 | 99.014 |
| 1251.0 | 99.038 |
| 1250.0 | 99.019 |
| 1249.0 | 98.98 |
| 1248.0 | 99.069 |
| 1247.0 | 99.089 |
| 1246.0 | 99.117 |
| 1245.0 | 99.079 |
| 1244.0 | 99.073 |
| 1243.0 | 99.106 |
| 1242.0 | 99.048 |
| 1241.0 | 99.036 |
| 1240.0 | 99.083 |
| 1239.0 | 99.067 |
| 1238.0 | 99.047 |
| 1237.0 | 99.066 |
| 1236.0 | 99.058 |
| 1235.0 | 99.044 |
| 1234.0 | 99.029 |
| 1233.0 | 99.019 |
| 1232.0 | 99.009 |
| 1231.0 | 99.013 |
| 1230.0 | 98.991 |
| 1229.0 | 98.994 |
| 1228.0 | 98.976 |
| 1227.0 | 98.989 |
| 1226.0 | 98.935 |
| 1225.0 | 98.982 |
| 1224.0 | 98.941 |
| 1223.0 | 98.967 |
| 1222.0 | 98.962 |
| 1221.0 | 98.97 |
| 1220.0 | 98.969 |
| 1219.0 | 98.986 |
| 1218.0 | 98.976 |
| 1217.0 | 99.005 |
| 1216.0 | 99.032 |
| 1215.0 | 99.055 |
| 1214.0 | 99.082 |
| 1213.0 | 99.059 |
| 1212.0 | 99.104 |
| 1211.0 | 99.169 |
| 1210.0 | 99.167 |
| 1209.0 | 99.205 |
| 1208.0 | 99.257 |
| 1207.0 | 99.29 |
| 1206.0 | 99.261 |
| 1205.0 | 99.234 |
| 1204.0 | 99.341 |
| 1203.0 | 99.39 |
| 1202.0 | 99.419 |
| 1201.0 | 99.404 |
| 1200.0 | 99.382 |
| 1199.0 | 99.477 |
| 1198.0 | 99.473 |
| 1197.0 | 99.495 |
| 1196.0 | 99.548 |
| 1195.0 | 99.515 |
| 1194.0 | 99.507 |
| 1193.0 | 99.559 |
| 1192.0 | 99.589 |
| 1191.0 | 99.557 |
| 1190.0 | 99.585 |
| 1189.0 | 99.589 |
| 1188.0 | 99.623 |
| 1187.0 | 99.605 |
| 1186.0 | 99.614 |
| 1185.0 | 99.582 |
| 1184.0 | 99.612 |
| 1183.0 | 99.646 |
| 1182.0 | 99.603 |
| 1181.0 | 99.655 |
| 1180.0 | 99.595 |
| 1179.0 | 99.62 |
| 1178.0 | 99.637 |
| 1177.0 | 99.614 |
| 1176.0 | 99.643 |
| 1175.0 | 99.645 |
| 1174.0 | 99.624 |
| 1173.0 | 99.63 |
| 1172.0 | 99.633 |
| 1171.0 | 99.645 |
| 1170.0 | 99.629 |
| 1169.0 | 99.641 |
| 1168.0 | 99.652 |
| 1167.0 | 99.628 |
| 1166.0 | 99.614 |
| 1165.0 | 99.631 |
| 1164.0 | 99.656 |
| 1163.0 | 99.711 |
| 1162.0 | 99.594 |
| 1161.0 | 99.592 |
| 1160.0 | 99.644 |
| 1159.0 | 99.653 |
| 1158.0 | 99.658 |
| 1157.0 | 99.705 |
| 1156.0 | 99.669 |
| 1155.0 | 99.669 |
| 1154.0 | 99.706 |
| 1153.0 | 99.681 |
| 1152.0 | 99.69 |
| 1151.0 | 99.692 |
| 1150.0 | 99.694 |
| 1149.0 | 99.717 |
| 1148.0 | 99.712 |
| 1147.0 | 99.698 |
| 1146.0 | 99.692 |
| 1145.0 | 99.682 |
| 1144.0 | 99.717 |
| 1143.0 | 99.706 |
| 1142.0 | 99.694 |
| 1141.0 | 99.711 |
| 1140.0 | 99.697 |
| 1139.0 | 99.708 |
| 1138.0 | 99.685 |
| 1137.0 | 99.721 |
| 1136.0 | 99.681 |
| 1135.0 | 99.706 |
| 1134.0 | 99.706 |
| 1133.0 | 99.721 |
| 1132.0 | 99.725 |
| 1131.0 | 99.711 |
| 1130.0 | 99.714 |
| 1129.0 | 99.712 |
| 1128.0 | 99.702 |
| 1127.0 | 99.708 |
| 1126.0 | 99.707 |
| 1125.0 | 99.717 |
| 1124.0 | 99.727 |
| 1123.0 | 99.72 |
| 1122.0 | 99.721 |
| 1121.0 | 99.73 |
| 1120.0 | 99.735 |
| 1119.0 | 99.739 |
| 1118.0 | 99.721 |
| 1117.0 | 99.735 |
| 1116.0 | 99.736 |
| 1115.0 | 99.734 |
| 1114.0 | 99.729 |
| 1113.0 | 99.745 |
| 1112.0 | 99.74 |
| 1111.0 | 99.739 |
| 1110.0 | 99.741 |
| 1109.0 | 99.759 |
| 1108.0 | 99.751 |
| 1107.0 | 99.762 |
| 1106.0 | 99.759 |
| 1105.0 | 99.752 |
| 1104.0 | 99.743 |
| 1103.0 | 99.758 |
| 1102.0 | 99.756 |
| 1101.0 | 99.757 |
| 1100.0 | 99.762 |
| 1099.0 | 99.758 |
| 1098.0 | 99.763 |
| 1097.0 | 99.772 |
| 1096.0 | 99.762 |
| 1095.0 | 99.749 |
| 1094.0 | 99.765 |
| 1093.0 | 99.762 |
| 1092.0 | 99.754 |
| 1091.0 | 99.745 |
| 1090.0 | 99.745 |
| 1089.0 | 99.741 |
| 1088.0 | 99.745 |
| 1087.0 | 99.742 |
| 1086.0 | 99.736 |
| 1085.0 | 99.729 |
| 1084.0 | 99.733 |
| 1083.0 | 99.721 |
| 1082.0 | 99.73 |
| 1081.0 | 99.732 |
| 1080.0 | 99.726 |
| 1079.0 | 99.73 |
| 1078.0 | 99.728 |
| 1077.0 | 99.72 |
| 1076.0 | 99.716 |
| 1075.0 | 99.719 |
| 1074.0 | 99.71 |
| 1073.0 | 99.716 |
| 1072.0 | 99.718 |
| 1071.0 | 99.717 |
| 1070.0 | 99.717 |
| 1069.0 | 99.734 |
| 1068.0 | 99.722 |
| 1067.0 | 99.727 |
| 1066.0 | 99.723 |
| 1065.0 | 99.73 |
| 1064.0 | 99.737 |
| 1063.0 | 99.738 |
| 1062.0 | 99.731 |
| 1061.0 | 99.732 |
| 1060.0 | 99.747 |
| 1059.0 | 99.745 |
| 1058.0 | 99.757 |
| 1057.0 | 99.755 |
| 1056.0 | 99.763 |
| 1055.0 | 99.77 |
| 1054.0 | 99.777 |
| 1053.0 | 99.777 |
| 1052.0 | 99.774 |
| 1051.0 | 99.761 |
| 1050.0 | 99.781 |
| 1049.0 | 99.779 |
| 1048.0 | 99.774 |
| 1047.0 | 99.776 |
| 1046.0 | 99.778 |
| 1045.0 | 99.765 |
| 1044.0 | 99.785 |
| 1043.0 | 99.779 |
| 1042.0 | 99.791 |
| 1041.0 | 99.776 |
| 1040.0 | 99.771 |
| 1039.0 | 99.786 |
| 1038.0 | 99.776 |
| 1037.0 | 99.783 |
| 1036.0 | 99.772 |
| 1035.0 | 99.767 |
| 1034.0 | 99.767 |
| 1033.0 | 99.775 |
| 1032.0 | 99.78 |
| 1031.0 | 99.782 |
| 1030.0 | 99.762 |
| 1029.0 | 99.772 |
| 1028.0 | 99.762 |
| 1027.0 | 99.768 |
| 1026.0 | 99.768 |
| 1025.0 | 99.777 |
| 1024.0 | 99.782 |
| 1023.0 | 99.772 |
| 1022.0 | 99.765 |
| 1021.0 | 99.769 |
| 1020.0 | 99.772 |
| 1019.0 | 99.768 |
| 1018.0 | 99.761 |
| 1017.0 | 99.756 |
| 1016.0 | 99.763 |
| 1015.0 | 99.745 |
| 1014.0 | 99.747 |
| 1013.0 | 99.749 |
| 1012.0 | 99.743 |
| 1011.0 | 99.735 |
| 1010.0 | 99.745 |
| 1009.0 | 99.724 |
| 1008.0 | 99.725 |
| 1007.0 | 99.721 |
| 1006.0 | 99.71 |
| 1005.0 | 99.702 |
| 1004.0 | 99.701 |
| 1003.0 | 99.695 |
| 1002.0 | 99.682 |
| 1001.0 | 99.664 |
| 1000.0 | 99.667 |
| 999.0 | 99.654 |
| 998.0 | 99.648 |
| 997.0 | 99.632 |
| 996.0 | 99.63 |
| 995.0 | 99.609 |
| 994.0 | 99.613 |
| 993.0 | 99.603 |
| 992.0 | 99.593 |
| 991.0 | 99.581 |
| 990.0 | 99.599 |
| 989.0 | 99.581 |
| 988.0 | 99.598 |
| 987.0 | 99.597 |
| 986.0 | 99.598 |
| 985.0 | 99.597 |
| 984.0 | 99.595 |
| 983.0 | 99.598 |
| 982.0 | 99.622 |
| 981.0 | 99.613 |
| 980.0 | 99.635 |
| 979.0 | 99.629 |
| 978.0 | 99.628 |
| 977.0 | 99.637 |
| 976.0 | 99.644 |
| 975.0 | 99.648 |
| 974.0 | 99.664 |
| 973.0 | 99.658 |
| 972.0 | 99.676 |
| 971.0 | 99.671 |
| 970.0 | 99.676 |
| 969.0 | 99.679 |
| 968.0 | 99.682 |
| 967.0 | 99.685 |
| 966.0 | 99.684 |
| 965.0 | 99.696 |
| 964.0 | 99.691 |
| 963.0 | 99.702 |
| 962.0 | 99.701 |
| 961.0 | 99.705 |
| 960.0 | 99.709 |
| 959.0 | 99.698 |
| 958.0 | 99.703 |
| 957.0 | 99.709 |
| 956.0 | 99.721 |
| 955.0 | 99.706 |
| 954.0 | 99.722 |
| 953.0 | 99.718 |
| 952.0 | 99.721 |
| 951.0 | 99.713 |
| 950.0 | 99.712 |
| 949.0 | 99.719 |
| 948.0 | 99.722 |
| 947.0 | 99.724 |
| 946.0 | 99.723 |
| 945.0 | 99.725 |
| 944.0 | 99.741 |
| 943.0 | 99.699 |
| 942.0 | 99.725 |
| 941.0 | 99.72 |
| 940.0 | 99.738 |
| 939.0 | 99.737 |
| 938.0 | 99.74 |
| 937.0 | 99.727 |
| 936.0 | 99.76 |
| 935.0 | 99.724 |
| 934.0 | 99.733 |
| 933.0 | 99.735 |
| 932.0 | 99.745 |
| 931.0 | 99.738 |
| 930.0 | 99.738 |
| 929.0 | 99.736 |
| 928.0 | 99.745 |
| 927.0 | 99.738 |
| 926.0 | 99.745 |
| 925.0 | 99.734 |
| 924.0 | 99.744 |
| 923.0 | 99.731 |
| 922.0 | 99.747 |
| 921.0 | 99.736 |
| 920.0 | 99.742 |
| 919.0 | 99.74 |
| 918.0 | 99.744 |
| 917.0 | 99.748 |
| 916.0 | 99.745 |
| 915.0 | 99.743 |
| 914.0 | 99.751 |
| 913.0 | 99.734 |
| 912.0 | 99.735 |
| 911.0 | 99.734 |
| 910.0 | 99.739 |
| 909.0 | 99.739 |
| 908.0 | 99.74 |
| 907.0 | 99.747 |
| 906.0 | 99.725 |
| 905.0 | 99.737 |
| 904.0 | 99.744 |
| 903.0 | 99.727 |
| 902.0 | 99.745 |
| 901.0 | 99.739 |
| 900.0 | 99.743 |
| 899.0 | 99.739 |
| 898.0 | 99.736 |
| 897.0 | 99.745 |
| 896.0 | 99.741 |
| 895.0 | 99.738 |
| 894.0 | 99.745 |
| 893.0 | 99.738 |
| 892.0 | 99.748 |
| 891.0 | 99.749 |
| 890.0 | 99.739 |
| 889.0 | 99.743 |
| 888.0 | 99.742 |
| 887.0 | 99.74 |
| 886.0 | 99.754 |
| 885.0 | 99.738 |
| 884.0 | 99.751 |
| 883.0 | 99.748 |
| 882.0 | 99.742 |
| 881.0 | 99.728 |
| 880.0 | 99.752 |
| 879.0 | 99.741 |
| 878.0 | 99.736 |
| 877.0 | 99.752 |
| 876.0 | 99.741 |
| 875.0 | 99.747 |
| 874.0 | 99.759 |
| 873.0 | 99.742 |
| 872.0 | 99.746 |
| 871.0 | 99.734 |
| 870.0 | 99.746 |
| 869.0 | 99.751 |
| 868.0 | 99.746 |
| 867.0 | 99.749 |
| 866.0 | 99.742 |
| 865.0 | 99.733 |
| 864.0 | 99.748 |
| 863.0 | 99.735 |
| 862.0 | 99.772 |
| 861.0 | 99.752 |
| 860.0 | 99.724 |
| 859.0 | 99.757 |
| 858.0 | 99.749 |
| 857.0 | 99.729 |
| 856.0 | 99.755 |
| 855.0 | 99.757 |
| 854.0 | 99.744 |
| 853.0 | 99.758 |
| 852.0 | 99.742 |
| 851.0 | 99.759 |
| 850.0 | 99.732 |
| 849.0 | 99.752 |
| 848.0 | 99.747 |
| 847.0 | 99.747 |
| 846.0 | 99.763 |
| 845.0 | 99.733 |
| 844.0 | 99.759 |
| 843.0 | 99.77 |
| 842.0 | 99.749 |
| 841.0 | 99.767 |
| 840.0 | 99.757 |
| 839.0 | 99.746 |
| 838.0 | 99.705 |
| 837.0 | 99.762 |
| 836.0 | 99.734 |
| 835.0 | 99.713 |
| 834.0 | 99.732 |
| 833.0 | 99.732 |
| 832.0 | 99.689 |
| 831.0 | 99.681 |
| 830.0 | 99.675 |
| 829.0 | 99.706 |
| 828.0 | 99.706 |
| 827.0 | 99.705 |
| 826.0 | 99.673 |
| 825.0 | 99.707 |
| 824.0 | 99.689 |
| 823.0 | 99.704 |
| 822.0 | 99.724 |
| 821.0 | 99.724 |
| 820.0 | 99.712 |
| 819.0 | 99.75 |
| 818.0 | 99.716 |
| 817.0 | 99.757 |
| 816.0 | 99.747 |
| 815.0 | 99.741 |
| 814.0 | 99.715 |
| 813.0 | 99.73 |
| 812.0 | 99.713 |
| 811.0 | 99.735 |
| 810.0 | 99.752 |
| 809.0 | 99.659 |
| 808.0 | 99.726 |
| 807.0 | 99.784 |
| 806.0 | 99.693 |
| 805.0 | 99.734 |
| 804.0 | 99.709 |
| 803.0 | 99.668 |
| 802.0 | 99.696 |
| 801.0 | 99.721 |
| 800.0 | 99.694 |
| 799.0 | 99.686 |
| 798.0 | 99.681 |
| 797.0 | 99.623 |
| 796.0 | 99.641 |
| 795.0 | 99.596 |
| 794.0 | 99.548 |
| 793.0 | 99.58 |
| 792.0 | 99.542 |
| 791.0 | 99.535 |
| 790.0 | 99.498 |
| 789.0 | 99.533 |
| 788.0 | 99.537 |
| 787.0 | 99.499 |
| 786.0 | 99.502 |
| 785.0 | 99.533 |
| 784.0 | 99.507 |
| 783.0 | 99.525 |
| 782.0 | 99.513 |
| 781.0 | 99.531 |
| 780.0 | 99.513 |
| 779.0 | 99.51 |
| 778.0 | 99.551 |
| 777.0 | 99.508 |
| 776.0 | 99.501 |
| 775.0 | 99.49 |
| 774.0 | 99.449 |
| 773.0 | 99.404 |
| 772.0 | 99.371 |
| 771.0 | 99.315 |
| 770.0 | 99.292 |
| 769.0 | 99.207 |
| 768.0 | 99.139 |
| 767.0 | 99.035 |
| 766.0 | 98.994 |
| 765.0 | 98.907 |
| 764.0 | 98.784 |
| 763.0 | 98.718 |
| 762.0 | 98.66 |
| 761.0 | 98.648 |
| 760.0 | 98.593 |
| 759.0 | 98.693 |
| 758.0 | 98.701 |
| 757.0 | 98.704 |
| 756.0 | 98.749 |
| 755.0 | 98.758 |
| 754.0 | 98.764 |
| 753.0 | 98.778 |
| 752.0 | 98.744 |
| 751.0 | 98.761 |
| 750.0 | 98.693 |
| 749.0 | 98.672 |
| 748.0 | 98.602 |
| 747.0 | 98.457 |
| 746.0 | 98.371 |
| 745.0 | 98.109 |
| 744.0 | 97.849 |
| 743.0 | 97.601 |
| 742.0 | 97.234 |
| 741.0 | 96.757 |
| 740.0 | 96.241 |
| 739.0 | 95.759 |
| 738.0 | 95.187 |
| 737.0 | 94.618 |
| 736.0 | 94.188 |
| 735.0 | 93.908 |
| 734.0 | 93.765 |
| 733.0 | 93.64 |
| 732.0 | 93.633 |
| 731.0 | 93.646 |
| 730.0 | 93.626 |
| 729.0 | 93.507 |
| 728.0 | 93.316 |
| 727.0 | 92.975 |
| 726.0 | 92.568 |
| 725.0 | 91.906 |
| 724.0 | 91.044 |
| 723.0 | 89.99 |
| 722.0 | 88.663 |
| 721.0 | 87.172 |
| 720.0 | 85.524 |
| 719.0 | 83.878 |
| 718.0 | 82.675 |
| 717.0 | 81.809 |
| 716.0 | 81.505 |
| 715.0 | 81.719 |
| 714.0 | 82.385 |
| 713.0 | 83.236 |
| 712.0 | 84.167 |
| 711.0 | 85.001 |
| 710.0 | 85.62 |
| 709.0 | 85.914 |
| 708.0 | 85.995 |
| 707.0 | 85.738 |
| 706.0 | 85.252 |
| 705.0 | 84.365 |
| 704.0 | 83.175 |
| 703.0 | 81.552 |
| 702.0 | 79.636 |
| 701.0 | 77.494 |
| 700.0 | 75.238 |
| 699.0 | 73.129 |
| 698.0 | 71.49 |
| 697.0 | 70.41 |
| 696.0 | 70.137 |
| 695.0 | 70.502 |
| 694.0 | 71.371 |
| 693.0 | 72.531 |
| 692.0 | 73.686 |
| 691.0 | 74.643 |
| 690.0 | 75.319 |
| 689.0 | 75.575 |
| 688.0 | 75.45 |
| 687.0 | 74.816 |
| 686.0 | 73.732 |
| 685.0 | 72.177 |
| 684.0 | 70.202 |
| 683.0 | 67.918 |
| 682.0 | 65.434 |
| 681.0 | 62.861 |
| 680.0 | 60.581 |
| 679.0 | 58.887 |
| 678.0 | 57.773 |
| 677.0 | 57.358 |
| 676.0 | 57.508 |
| 675.0 | 58.054 |
| 674.0 | 58.681 |
| 673.0 | 59.209 |
| 672.0 | 59.326 |
| 671.0 | 58.901 |
| 670.0 | 57.793 |
| 669.0 | 55.858 |
| 668.0 | 53.055 |
| 667.0 | 49.446 |
| 666.0 | 44.966 |
| 665.0 | 39.772 |
| 664.0 | 34.393 |
| 663.0 | 29.223 |
| 662.0 | 24.736 |
| 661.0 | 21.506 |
| 660.0 | 19.727 |
| 659.0 | 19.345 |
| 658.0 | 19.95 |
| 657.0 | 21.02 |
| 656.0 | 22.028 |
| 655.0 | 22.378 |
| 654.0 | 21.794 |
| 653.0 | 20.103 |
| 652.0 | 17.364 |
| 651.0 | 13.891 |
| 650.0 | 10.046 |
| 649.0 | 6.537 |
| 648.0 | 4.157 |
| 647.0 | 3.404 |
| 646.0 | 4.792 |
| 645.0 | 8.006 |
| 644.0 | 12.643 |
| 643.0 | 17.858 |
| 642.0 | 22.94 |
| 641.0 | 27.345 |
| 640.0 | 30.576 |
| 639.0 | 32.506 |
| 638.0 | 33.042 |
| 637.0 | 32.268 |
| 636.0 | 30.286 |
| 635.0 | 27.385 |
| 634.0 | 24.061 |
| 633.0 | 20.86 |
| 632.0 | 18.478 |
| 631.0 | 17.456 |
| 630.0 | 18.092 |
| 629.0 | 20.263 |
| 628.0 | 23.555 |
| 627.0 | 27.352 |
| 626.0 | 30.978 |
| 625.0 | 33.907 |
| 624.0 | 35.763 |
| 623.0 | 36.453 |
| 622.0 | 35.827 |
| 621.0 | 34.127 |
| 620.0 | 31.452 |
| 619.0 | 28.353 |
| 618.0 | 25.436 |
| 617.0 | 23.423 |
| 616.0 | 22.851 |
| 615.0 | 24.011 |
| 614.0 | 26.804 |
| 613.0 | 30.668 |
| 612.0 | 34.913 |
| 611.0 | 38.959 |
| 610.0 | 42.19 |
| 609.0 | 44.325 |
| 608.0 | 45.27 |
| 607.0 | 45.052 |
| 606.0 | 43.794 |
| 605.0 | 41.764 |
| 604.0 | 39.442 |
| 603.0 | 37.272 |
| 602.0 | 35.976 |
| 601.0 | 35.894 |
| 600.0 | 37.267 |
| 599.0 | 39.856 |
| 598.0 | 43.147 |
| 597.0 | 46.623 |
| 596.0 | 49.694 |
| 595.0 | 52.021 |
| 594.0 | 53.245 |
| 593.0 | 53.312 |
| 592.0 | 52.209 |
| 591.0 | 49.984 |
| 590.0 | 47.001 |
| 589.0 | 43.623 |
| 588.0 | 40.447 |
| 587.0 | 38.108 |
| 586.0 | 37.144 |
| 585.0 | 37.623 |
| 584.0 | 39.414 |
| 583.0 | 41.985 |
| 582.0 | 44.581 |
| 581.0 | 46.683 |
| 580.0 | 47.825 |
| 579.0 | 47.832 |
| 578.0 | 46.594 |
| 577.0 | 44.289 |
| 576.0 | 41.279 |
| 575.0 | 38.061 |
| 574.0 | 35.252 |
| 573.0 | 33.322 |
| 572.0 | 32.69 |
| 571.0 | 33.268 |
| 570.0 | 34.66 |
| 569.0 | 36.27 |
| 568.0 | 37.54 |
| 567.0 | 37.967 |
| 566.0 | 37.467 |
| 565.0 | 36.122 |
| 564.0 | 34.408 |
| 563.0 | 33.062 |
| 562.0 | 32.632 |
| 561.0 | 33.531 |
| 560.0 | 35.875 |
| 559.0 | 39.106 |
| 558.0 | 42.665 |
| 557.0 | 45.753 |
| 556.0 | 47.792 |
| 555.0 | 48.116 |
| 554.0 | 46.749 |
| 553.0 | 43.542 |
| 552.0 | 38.801 |
| 551.0 | 33.374 |
| 550.0 | 28.42 |
| 549.0 | 25.262 |
| 548.0 | 24.863 |
| 547.0 | 27.299 |
| 546.0 | 31.866 |
| 545.0 | 37.15 |
| 544.0 | 41.796 |
| 543.0 | 44.974 |
| 542.0 | 46.292 |
| 541.0 | 45.729 |
| 540.0 | 43.699 |
| 539.0 | 40.842 |
| 538.0 | 37.855 |
| 537.0 | 35.614 |
| 536.0 | 34.634 |
| 535.0 | 34.934 |
| 534.0 | 36.102 |
| 533.0 | 37.335 |
| 532.0 | 37.85 |
| 531.0 | 37.009 |
| 530.0 | 34.751 |
| 529.0 | 31.44 |
| 528.0 | 28.132 |
| 527.0 | 26.033 |
| 526.0 | 25.999 |
| 525.0 | 28.431 |
| 524.0 | 32.662 |
| 523.0 | 37.72 |
| 522.0 | 42.298 |
| 521.0 | 45.51 |
| 520.0 | 46.929 |
| 519.0 | 46.52 |
| 518.0 | 44.659 |
| 517.0 | 42.063 |
| 516.0 | 39.387 |
| 515.0 | 37.364 |
| 514.0 | 36.336 |
| 513.0 | 36.371 |
| 512.0 | 37.022 |
| 511.0 | 37.579 |
| 510.0 | 37.646 |
| 509.0 | 36.953 |
| 508.0 | 35.504 |
| 507.0 | 33.562 |
| 506.0 | 31.472 |
| 505.0 | 29.414 |
| 504.0 | 27.484 |
| 503.0 | 25.561 |
| 502.0 | 23.846 |
| 501.0 | 22.778 |
| 500.0 | 23.034 |
| 499.0 | 25.118 |
| 498.0 | 29.215 |
| 497.0 | 34.592 |
| 496.0 | 40.136 |
| 495.0 | 44.435 |
| 494.0 | 46.167 |
| 493.0 | 44.396 |
| 492.0 | 38.88 |
| 491.0 | 30.601 |
| 490.0 | 22.09 |
| 489.0 | 16.372 |
| 488.0 | 15.659 |
| 487.0 | 20.059 |
| 486.0 | 27.28 |
| 485.0 | 33.856 |
| 484.0 | 36.721 |
| 483.0 | 34.829 |
| 482.0 | 29.36 |
| 481.0 | 23.565 |
| 480.0 | 20.696 |
| 479.0 | 23.067 |
| 478.0 | 29.93 |
| 477.0 | 38.502 |
| 476.0 | 45.249 |
| 475.0 | 47.089 |
| 474.0 | 43.088 |
| 473.0 | 34.953 |
| 472.0 | 26.228 |
| 471.0 | 20.683 |
| 470.0 | 21.084 |
| 469.0 | 26.587 |
| 468.0 | 33.743 |
| 467.0 | 38.528 |
| 466.0 | 38.129 |
| 465.0 | 32.505 |
| 464.0 | 24.244 |
| 463.0 | 16.484 |
| 462.0 | 11.566 |
| 461.0 | 9.786 |
| 460.0 | 10.238 |
| 459.0 | 12.129 |
| 458.0 | 15.687 |
| 457.0 | 21.917 |
| 456.0 | 30.908 |
| 455.0 | 40.266 |
| 454.0 | 47.654 |
| 453.0 | 51.749 |
| 452.0 | 53.508 |
| 451.0 | 55.498 |
| 450.0 | 60.089 |
| 449.0 | 67.266 |
| 448.0 | 74.811 |
| 447.0 | 80.231 |
| 446.0 | 81.607 |
| 445.0 | 79.446 |
| 444.0 | 75.859 |
| 443.0 | 73.78 |
| 442.0 | 75.306 |
| 441.0 | 79.837 |
| 440.0 | 85.003 |
| 439.0 | 88.778 |
| 438.0 | 89.345 |
| 437.0 | 87.723 |
| 436.0 | 85.626 |
| 435.0 | 84.918 |
| 434.0 | 86.077 |
| 433.0 | 88.327 |
| 432.0 | 90.271 |
| 431.0 | 91.338 |
| 430.0 | 90.728 |
| 429.0 | 89.501 |
| 428.0 | 88.683 |
| 427.0 | 88.795 |
| 426.0 | 89.881 |
| 425.0 | 91.254 |
| 424.0 | 92.082 |
| 423.0 | 91.735 |
| 422.0 | 90.222 |
| 421.0 | 88.86 |
| 420.0 | 87.808 |
| 419.0 | 88.301 |
| 418.0 | 89.381 |
| 417.0 | 90.663 |
| 416.0 | 91.476 |
| 415.0 | 90.605 |
| 414.0 | 88.649 |
| 413.0 | 85.996 |
| 412.0 | 84.007 |
| 411.0 | 84.21 |
| 410.0 | 85.654 |
| 409.0 | 87.167 |
| 408.0 | 87.436 |
| 407.0 | 85.82 |
| 406.0 | 82.728 |
| 405.0 | 80.092 |
| 404.0 | 79.044 |
| 403.0 | 79.787 |
| 402.0 | 81.039 |
| 401.0 | 80.941 |
| 400.0 | 78.537 |
| 399.0 | 75.091 |
| 398.0 | 72.073 |
| 397.0 | 72.102 |
| 396.0 | 74.9 |
| 395.0 | 79.303 |
| 394.0 | 82.614 |
| 393.0 | 82.069 |
| 392.0 | 77.889 |
| 391.0 | 71.849 |
| 390.0 | 66.23 |
| 389.0 | 65.291 |
| 388.0 | 67.702 |
| 387.0 | 71.352 |
| 386.0 | 75.291 |
| 385.0 | 75.209 |
| 384.0 | 68.918 |
| 383.0 | 61.213 |
| 382.0 | 53.175 |
| 381.0 | 49.792 |
| 380.0 | 52.103 |
| 379.0 | 58.358 |
| 378.0 | 64.473 |
| 377.0 | 67.261 |
| 376.0 | 63.156 |
| 375.0 | 55.141 |
| 374.0 | 43.836 |
| 373.0 | 34.399 |
| 372.0 | 31.87 |
| 371.0 | 35.233 |
| 370.0 | 42.394 |
| 369.0 | 49.498 |
| 368.0 | 52.152 |
| 367.0 | 50.357 |
| 366.0 | 44.521 |
| 365.0 | 34.522 |
| 364.0 | 25.789 |
| 363.0 | 17.428 |
| 362.0 | 12.924 |
| 361.0 | 13.118 |
| 360.0 | 13.446 |
| 359.0 | 14.376 |
| 358.0 | 13.941 |
| 357.0 | 13.974 |
| 356.0 | 16.065 |
| 355.0 | 15.886 |
| 354.0 | 18.046 |
| 353.0 | 20.654 |
| 352.0 | 21.761 |
| 351.0 | 22.747 |
| 350.0 | 22.883 |
| 349.0 | 23.76 |
| 348.0 | 22.676 |
| 347.0 | 20.225 |
| 346.0 | 18.323 |
| 345.0 | 14.862 |
| 344.0 | 14.699 |
| 343.0 | 14.811 |
| 342.0 | 12.739 |
| 341.0 | 12.269 |
| 340.0 | 12.643 |
| 339.0 | 10.262 |
| 338.0 | 11.366 |
| 337.0 | 10.4 |
| 336.0 | 11.215 |
| 335.0 | 12.746 |
| 334.0 | 11.005 |
| 333.0 | 8.013 |
| 332.0 | 8.554 |
| 331.0 | 6.513 |
| 330.0 | 7.096 |
| 329.0 | 5.375 |
| 328.0 | 7.864 |
| 327.0 | 6.421 |
| 326.0 | 4.754 |
| 325.0 | 5.482 |
| 324.0 | 2.701 |
| 323.0 | 2.006 |
| 322.0 | 6.627 |
| 321.0 | 3.242 |
| 320.0 | 4.516 |
| 319.0 | 4.158 |
| 318.0 | 2.127 |
| 317.0 | 7.071 |
| 316.0 | 8.237 |
| 315.0 | 3.405 |
| 314.0 | 7.699 |
| 313.0 | 3.055 |
| 312.0 | 5.904 |
| 311.0 | 2.315 |
| 310.0 | 2.98 |
| 309.0 | 10.445 |
| 308.0 | 7.111 |
| 307.0 | 6.304 |
| 306.0 | 3.029 |
| 305.0 | 4.239 |
| 304.0 | 6.741 |
| 303.0 | 5.849 |
| 302.0 | 9.179 |
| 301.0 | 5.957 |
| 300.0 | 8.58 |
| 299.0 | 6.528 |
| 298.0 | 9.109 |
| 297.0 | 6.123 |
| 296.0 | 7.666 |
| 295.0 | 9.433 |
| 294.0 | 7.789 |
| 293.0 | 7.582 |
| 292.0 | 8.643 |
| 291.0 | 9.844 |
| 290.0 | 7.378 |
| 289.0 | 6.891 |
| 288.0 | 7.844 |
| 287.0 | 8.873 |
| 286.0 | 7.423 |
| 285.0 | 9.66 |
| 284.0 | 11.168 |
| 283.0 | 9.844 |
| 282.0 | 10.984 |
| 281.0 | 13.003 |
| 280.0 | 10.789 |
| 279.0 | 12.543 |
| 278.0 | 11.139 |
| 277.0 | 13.859 |
| 276.0 | 11.968 |
| 275.0 | 11.98 |
| 274.0 | 12.43 |
| 273.0 | 12.999 |
| 272.0 | 13.086 |
| 271.0 | 14.122 |
| 270.0 | 12.137 |
| 269.0 | 14.78 |
| 268.0 | 13.399 |
| 267.0 | 12.989 |
| 266.0 | 13.898 |
| 265.0 | 14.325 |
| 264.0 | 15.495 |
| 263.0 | 15.165 |
| 262.0 | 15.036 |
| 261.0 | 16.097 |
| 260.0 | 16.193 |
| 259.0 | 17.525 |
| 258.0 | 16.548 |
| 257.0 | 16.508 |
| 256.0 | 17.392 |
| 255.0 | 16.938 |
| 254.0 | 17.52 |
| 253.0 | 17.935 |
| 252.0 | 17.425 |
| 251.0 | 17.513 |
| 250.0 | 18.781 |